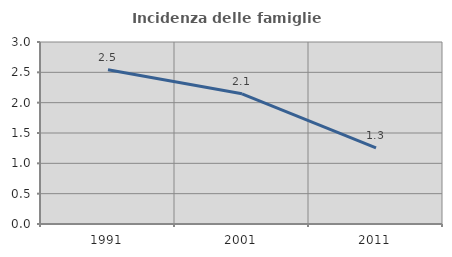
| Category | Incidenza delle famiglie numerose |
|---|---|
| 1991.0 | 2.542 |
| 2001.0 | 2.146 |
| 2011.0 | 1.255 |